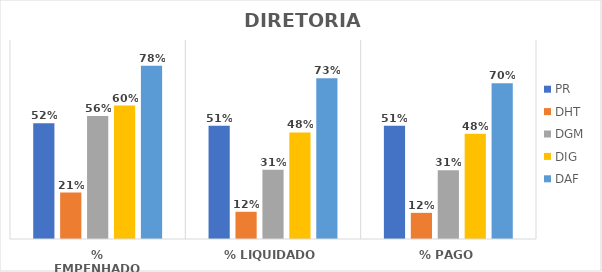
| Category | PR | DHT | DGM | DIG | DAF |
|---|---|---|---|---|---|
| % EMPENHADO | 0.523 | 0.21 | 0.556 | 0.603 | 0.784 |
| % LIQUIDADO | 0.512 | 0.123 | 0.313 | 0.482 | 0.727 |
| % PAGO | 0.512 | 0.118 | 0.311 | 0.476 | 0.705 |